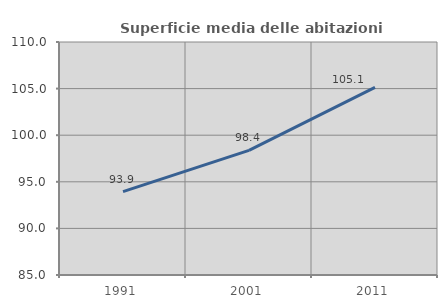
| Category | Superficie media delle abitazioni occupate |
|---|---|
| 1991.0 | 93.948 |
| 2001.0 | 98.367 |
| 2011.0 | 105.135 |